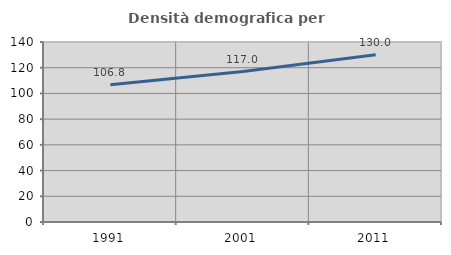
| Category | Densità demografica |
|---|---|
| 1991.0 | 106.758 |
| 2001.0 | 116.995 |
| 2011.0 | 130.024 |